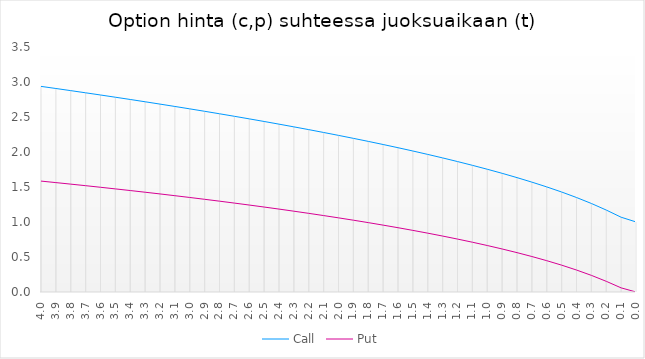
| Category | Call | Put |
|---|---|---|
| 4.000000000000002 | 2.937 | 1.584 |
| 3.9000000000000017 | 2.907 | 1.563 |
| 3.8000000000000016 | 2.877 | 1.541 |
| 3.7000000000000015 | 2.846 | 1.519 |
| 3.6000000000000014 | 2.814 | 1.496 |
| 3.5000000000000013 | 2.783 | 1.473 |
| 3.4000000000000012 | 2.75 | 1.449 |
| 3.300000000000001 | 2.718 | 1.425 |
| 3.200000000000001 | 2.684 | 1.401 |
| 3.100000000000001 | 2.651 | 1.376 |
| 3.000000000000001 | 2.616 | 1.35 |
| 2.900000000000001 | 2.582 | 1.324 |
| 2.8000000000000007 | 2.546 | 1.298 |
| 2.7000000000000006 | 2.51 | 1.27 |
| 2.6000000000000005 | 2.473 | 1.242 |
| 2.5000000000000004 | 2.436 | 1.214 |
| 2.4000000000000004 | 2.398 | 1.184 |
| 2.3000000000000003 | 2.359 | 1.154 |
| 2.2 | 2.319 | 1.124 |
| 2.1 | 2.279 | 1.092 |
| 2.0 | 2.237 | 1.059 |
| 1.9 | 2.195 | 1.026 |
| 1.7999999999999998 | 2.152 | 0.991 |
| 1.6999999999999997 | 2.107 | 0.955 |
| 1.5999999999999996 | 2.061 | 0.918 |
| 1.4999999999999996 | 2.014 | 0.88 |
| 1.3999999999999995 | 1.966 | 0.84 |
| 1.2999999999999994 | 1.915 | 0.799 |
| 1.1999999999999993 | 1.864 | 0.756 |
| 1.0999999999999992 | 1.81 | 0.711 |
| 0.9999999999999992 | 1.754 | 0.664 |
| 0.8999999999999992 | 1.695 | 0.615 |
| 0.7999999999999993 | 1.634 | 0.562 |
| 0.6999999999999993 | 1.57 | 0.507 |
| 0.5999999999999993 | 1.501 | 0.447 |
| 0.49999999999999933 | 1.428 | 0.384 |
| 0.39999999999999936 | 1.35 | 0.314 |
| 0.2999999999999994 | 1.265 | 0.238 |
| 0.19999999999999937 | 1.171 | 0.153 |
| 0.09999999999999937 | 1.068 | 0.059 |
| 0.01 | 1.001 | 0 |